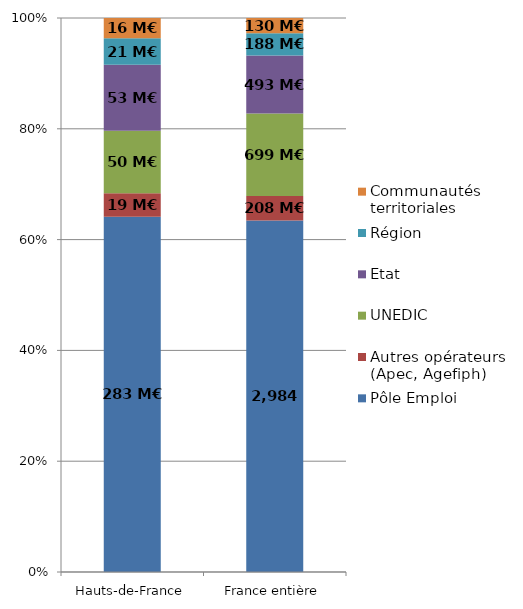
| Category | Pôle Emploi | Autres opérateurs (Apec, Agefiph) | UNEDIC | Etat | Région | Communautés territoriales |
|---|---|---|---|---|---|---|
| Hauts-de-France | 283.092 | 18.666 | 49.868 | 52.532 | 21.093 | 16.21 |
| France entière | 2983.694 | 207.577 | 699.479 | 493.308 | 188.079 | 129.71 |